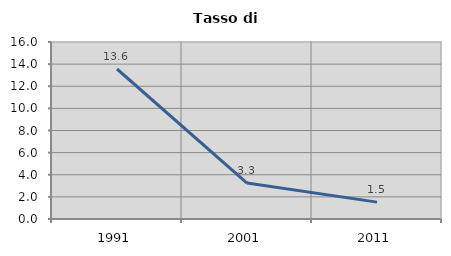
| Category | Tasso di disoccupazione   |
|---|---|
| 1991.0 | 13.559 |
| 2001.0 | 3.252 |
| 2011.0 | 1.527 |